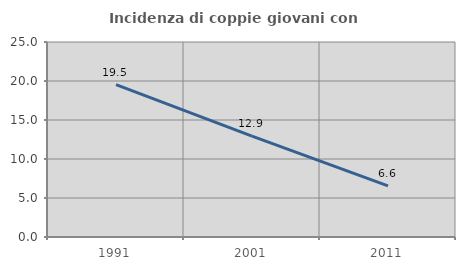
| Category | Incidenza di coppie giovani con figli |
|---|---|
| 1991.0 | 19.527 |
| 2001.0 | 12.935 |
| 2011.0 | 6.553 |